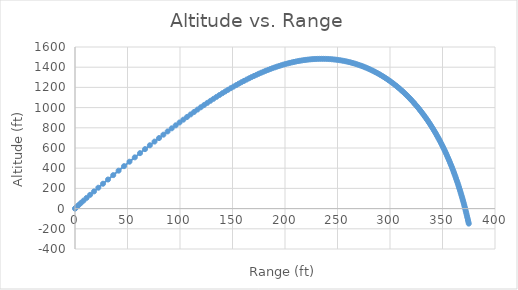
| Category | Series 0 |
|---|---|
| 0.0 | 0 |
| 0.2997872337403763 | 3.427 |
| 0.9825274633284682 | 10.56 |
| 2.094083340063765 | 21.672 |
| 3.651149565957823 | 36.799 |
| 5.662341166658357 | 55.93 |
| 8.129091120276115 | 79.007 |
| 11.037734943125566 | 105.843 |
| 14.370883792915617 | 136.231 |
| 18.10802066981303 | 169.945 |
| 22.226054558678808 | 206.744 |
| 26.68441758920218 | 246.239 |
| 31.441234446234347 | 288.037 |
| 36.421553803002865 | 331.465 |
| 41.5178708839551 | 375.577 |
| 46.6932485484674 | 420.05 |
| 51.87662988655845 | 464.271 |
| 56.962903378623395 | 507.351 |
| 61.90498078445779 | 548.898 |
| 66.69439305803743 | 588.853 |
| 71.30448535815204 | 627.005 |
| 75.74981588301529 | 663.486 |
| 80.0432696753287 | 698.412 |
| 84.1963085669278 | 731.887 |
| 88.21917581084182 | 764.004 |
| 92.12106496550089 | 794.847 |
| 95.91026030986454 | 824.489 |
| 99.59425438826138 | 852.998 |
| 103.1798470342549 | 880.437 |
| 106.67322928325532 | 906.859 |
| 110.08005486976798 | 932.317 |
| 113.40550145767811 | 956.856 |
| 116.65432332831988 | 980.52 |
| 119.83089692052462 | 1003.346 |
| 122.93926035691825 | 1025.372 |
| 125.98314788484963 | 1046.63 |
| 128.96601999611957 | 1067.151 |
| 131.89108985785006 | 1086.963 |
| 134.761346580342 | 1106.093 |
| 137.5795757612373 | 1124.566 |
| 140.34837767458677 | 1142.403 |
| 143.07018341532086 | 1159.627 |
| 145.74726926161998 | 1176.257 |
| 148.38176947782287 | 1192.311 |
| 150.9756877472356 | 1207.807 |
| 153.53090739627973 | 1222.761 |
| 156.0492005478531 | 1237.188 |
| 158.53223632177705 | 1251.102 |
| 160.98158818312248 | 1264.517 |
| 163.39874052452086 | 1277.445 |
| 165.7850945558415 | 1289.898 |
| 168.14197356350058 | 1301.887 |
| 170.47062759186466 | 1313.422 |
| 172.7722375904826 | 1324.513 |
| 175.04791906302464 | 1335.169 |
| 177.29872524667365 | 1345.4 |
| 179.52564984418999 | 1355.213 |
| 181.72962932489756 | 1364.615 |
| 183.91154480542966 | 1373.615 |
| 186.07222351633652 | 1382.219 |
| 188.21243985685905 | 1390.433 |
| 190.3329160378168 | 1398.263 |
| 192.43432231252777 | 1405.716 |
| 194.51727679947115 | 1412.797 |
| 196.5823449105142 | 1419.51 |
| 198.6300384190643 | 1425.861 |
| 200.6608142402414 | 1431.854 |
| 202.67507306121163 | 1437.494 |
| 204.67315807246433 | 1442.784 |
| 206.6553542401269 | 1447.729 |
| 208.62188887482 | 1452.332 |
| 210.57293477488173 | 1456.598 |
| 212.50861808173582 | 1460.529 |
| 214.4290343891419 | 1464.129 |
| 216.33427890675284 | 1467.402 |
| 218.22450001363438 | 1470.351 |
| 220.09999078245278 | 1472.981 |
| 221.96134000247162 | 1475.295 |
| 223.80967100441958 | 1477.298 |
| 225.64699576072707 | 1478.993 |
| 227.47668277869084 | 1480.386 |
| 229.30393790703297 | 1481.479 |
| 231.13597779803285 | 1482.274 |
| 232.98129030411917 | 1482.768 |
| 234.84742539647596 | 1482.953 |
| 236.73781316370332 | 1482.816 |
| 238.64975405716285 | 1482.345 |
| 240.57552653258784 | 1481.53 |
| 242.5057365082534 | 1480.367 |
| 244.43226661422617 | 1478.858 |
| 246.3494640190942 | 1477.006 |
| 248.2539814645911 | 1474.816 |
| 250.14412737910286 | 1472.293 |
| 252.01923433280768 | 1469.441 |
| 253.8792025763356 | 1466.266 |
| 255.72421227993263 | 1462.77 |
| 257.5545562558995 | 1458.958 |
| 259.3705486765001 | 1454.833 |
| 261.1724786992428 | 1450.397 |
| 262.96058954968953 | 1445.655 |
| 264.7350715390316 | 1440.609 |
| 266.49606239642503 | 1435.263 |
| 268.24365119185165 | 1429.619 |
| 269.9778837951511 | 1423.682 |
| 271.6987687665462 | 1417.453 |
| 273.4062831085376 | 1410.938 |
| 275.1003776065863 | 1404.139 |
| 276.78098164894266 | 1397.059 |
| 278.44800750281735 | 1389.703 |
| 280.1013540681653 | 1382.074 |
| 281.7409101506589 | 1374.176 |
| 283.3665573027654 | 1366.013 |
| 284.97817228233936 | 1357.588 |
| 286.57562917525337 | 1348.906 |
| 288.1588012242239 | 1339.971 |
| 289.7275624011975 | 1330.786 |
| 291.28178875597547 | 1321.357 |
| 292.8213595694393 | 1311.686 |
| 294.34615833588987 | 1301.778 |
| 295.85607359565364 | 1291.638 |
| 297.3509996362136 | 1281.27 |
| 298.83083707764166 | 1270.677 |
| 300.2954933560029 | 1259.865 |
| 301.7448831166073 | 1248.837 |
| 303.17892852746536 | 1237.598 |
| 304.5975595220119 | 1226.152 |
| 306.00071397906396 | 1214.503 |
| 307.38833784704127 | 1202.656 |
| 308.76038521867855 | 1190.614 |
| 310.1168183617693 | 1178.383 |
| 311.4576077108888 | 1165.966 |
| 312.78273182453165 | 1153.368 |
| 314.0921773116508 | 1140.592 |
| 315.385938731196 | 1127.643 |
| 316.66401846790495 | 1114.525 |
| 317.92642658729744 | 1101.241 |
| 319.1731806725521 | 1087.797 |
| 320.404305645705 | 1074.195 |
| 321.6198335753914 | 1060.441 |
| 322.8198034731576 | 1046.537 |
| 324.0042610801913 | 1032.487 |
| 325.1732586461582 | 1018.296 |
| 326.3268547016838 | 1003.966 |
| 327.4651138258849 | 989.502 |
| 328.58810641022956 | 974.907 |
| 329.69590841989003 | 960.185 |
| 330.7886011536453 | 945.339 |
| 331.8662710032934 | 930.373 |
| 332.92900921343966 | 915.29 |
| 333.97691164244446 | 900.092 |
| 335.0100785252328 | 884.785 |
| 336.02861423859633 | 869.369 |
| 337.0326270695497 | 853.85 |
| 338.02222898723886 | 838.229 |
| 338.99753541884144 | 822.51 |
| 339.958665029843 | 806.695 |
| 340.905739509024 | 790.788 |
| 341.83888335844307 | 774.792 |
| 342.75822368866164 | 758.708 |
| 343.6638900194113 | 742.539 |
| 344.5560140858718 | 726.289 |
| 345.43472965069043 | 709.96 |
| 346.3001723218444 | 693.554 |
| 347.15247937641846 | 677.073 |
| 347.99178959034333 | 660.521 |
| 348.8182430741177 | 643.898 |
| 349.63198111451356 | 627.208 |
| 350.43314602224723 | 610.453 |
| 351.22188098557785 | 593.635 |
| 351.9983299297822 | 576.755 |
| 352.7626373824384 | 559.817 |
| 353.5149483444401 | 542.821 |
| 354.25540816664994 | 525.77 |
| 354.98416243209357 | 508.665 |
| 355.701356843585 | 491.509 |
| 356.4071371166681 | 474.304 |
| 357.10164887775215 | 457.05 |
| 357.7850375673154 | 439.749 |
| 358.4574483480441 | 422.404 |
| 359.1190260177742 | 405.015 |
| 359.7699149270971 | 387.585 |
| 360.4102589014915 | 370.114 |
| 361.04020116784096 | 352.604 |
| 361.6598842851959 | 335.057 |
| 362.2694500796397 | 317.474 |
| 362.86903958311757 | 299.856 |
| 363.45879297608957 | 282.204 |
| 364.0388495338676 | 264.521 |
| 364.60934757650097 | 246.806 |
| 365.1704244220735 | 229.061 |
| 365.7222163432808 | 211.287 |
| 366.2648585271556 | 193.486 |
| 366.7984850378126 | 175.657 |
| 367.32322878208896 | 157.804 |
| 367.8392214779551 | 139.925 |
| 368.346593625578 | 122.023 |
| 368.84547448091905 | 104.098 |
| 369.33599203175316 | 86.152 |
| 369.81827297599847 | 68.184 |
| 370.2924427022491 | 50.196 |
| 370.7586252724076 | 32.189 |
| 371.21694340631535 | 14.164 |
| 371.6675184682842 | -3.88 |
| 372.11047045543415 | -21.94 |
| 372.54591798774715 | -40.016 |
| 372.97397829974767 | -58.108 |
| 373.3947672337267 | -76.215 |
| 373.80839923442664 | -94.337 |
| 374.2149873451086 | -112.471 |
| 374.6146432049271 | -130.619 |
| 375.00747704753877 | -148.779 |